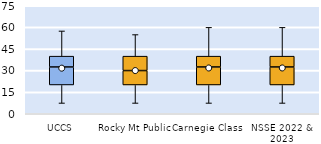
| Category | 25th | 50th | 75th |
|---|---|---|---|
| UCCS | 20 | 12.5 | 7.5 |
| Rocky Mt Public | 20 | 10 | 10 |
| Carnegie Class | 20 | 12.5 | 7.5 |
| NSSE 2022 & 2023 | 20 | 12.5 | 7.5 |